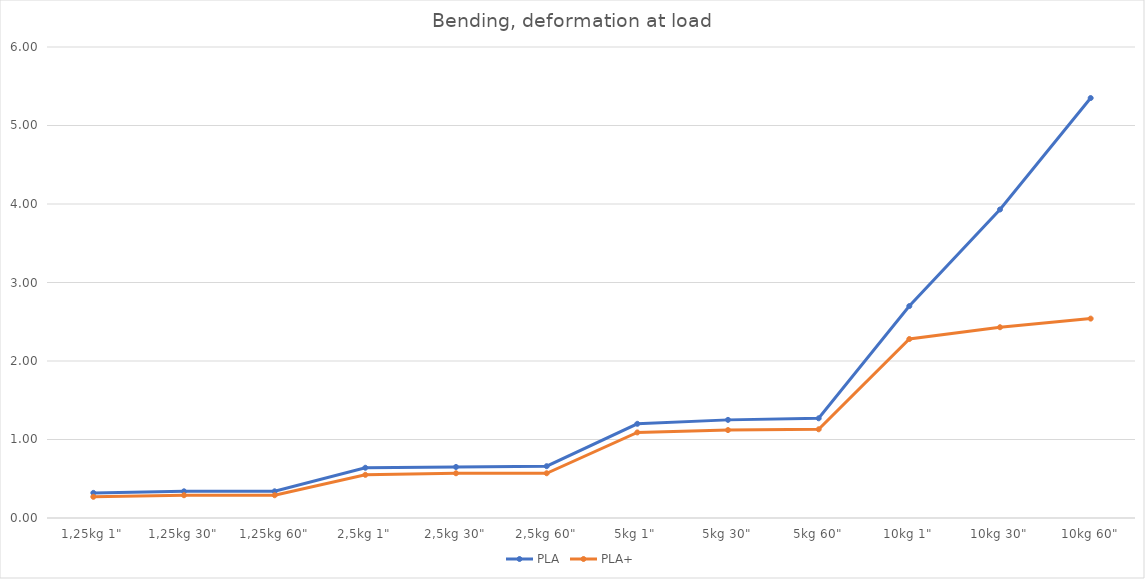
| Category | PLA | PLA+ |
|---|---|---|
| 1,25kg 1" | 0.32 | 0.27 |
| 1,25kg 30" | 0.34 | 0.29 |
| 1,25kg 60" | 0.34 | 0.29 |
| 2,5kg 1" | 0.64 | 0.55 |
| 2,5kg 30" | 0.65 | 0.57 |
| 2,5kg 60" | 0.66 | 0.57 |
| 5kg 1" | 1.2 | 1.09 |
| 5kg 30" | 1.25 | 1.12 |
| 5kg 60" | 1.27 | 1.13 |
| 10kg 1" | 2.7 | 2.28 |
| 10kg 30" | 3.93 | 2.43 |
| 10kg 60" | 5.35 | 2.54 |